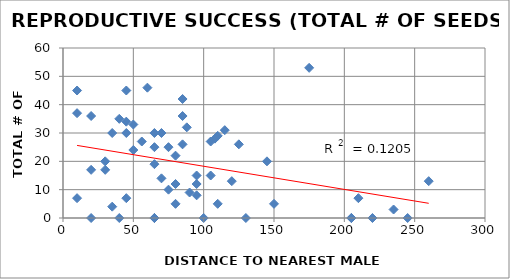
| Category | FER |
|---|---|
| 10.0 | 7 |
| 10.0 | 37 |
| 10.0 | 45 |
| 20.0 | 17 |
| 20.0 | 36 |
| 20.0 | 0 |
| 30.0 | 20 |
| 30.0 | 17 |
| 35.0 | 30 |
| 35.0 | 4 |
| 40.0 | 0 |
| 40.0 | 35 |
| 45.0 | 34 |
| 45.0 | 7 |
| 45.0 | 30 |
| 45.0 | 45 |
| 50.0 | 24 |
| 50.0 | 33 |
| 56.0 | 27 |
| 60.0 | 46 |
| 65.0 | 30 |
| 65.0 | 0 |
| 65.0 | 25 |
| 65.0 | 0 |
| 65.0 | 19 |
| 70.0 | 30 |
| 70.0 | 14 |
| 75.0 | 10 |
| 75.0 | 25 |
| 80.0 | 22 |
| 80.0 | 12 |
| 80.0 | 5 |
| 85.0 | 42 |
| 85.0 | 26 |
| 85.0 | 36 |
| 88.0 | 32 |
| 90.0 | 9 |
| 95.0 | 8 |
| 95.0 | 12 |
| 95.0 | 15 |
| 100.0 | 0 |
| 105.0 | 15 |
| 105.0 | 27 |
| 108.0 | 28 |
| 110.0 | 29 |
| 110.0 | 5 |
| 115.0 | 31 |
| 120.0 | 13 |
| 125.0 | 26 |
| 130.0 | 0 |
| 145.0 | 20 |
| 150.0 | 5 |
| 175.0 | 53 |
| 205.0 | 0 |
| 205.0 | 0 |
| 210.0 | 7 |
| 220.0 | 0 |
| 235.0 | 3 |
| 245.0 | 0 |
| 260.0 | 13 |